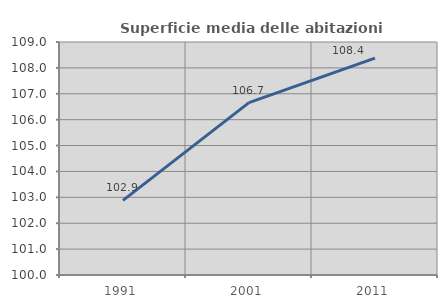
| Category | Superficie media delle abitazioni occupate |
|---|---|
| 1991.0 | 102.88 |
| 2001.0 | 106.659 |
| 2011.0 | 108.376 |